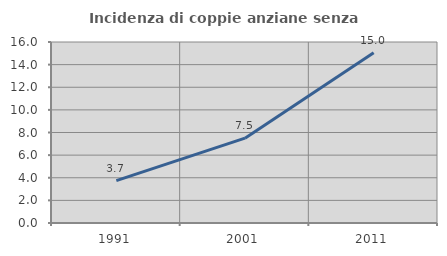
| Category | Incidenza di coppie anziane senza figli  |
|---|---|
| 1991.0 | 3.746 |
| 2001.0 | 7.502 |
| 2011.0 | 15.05 |